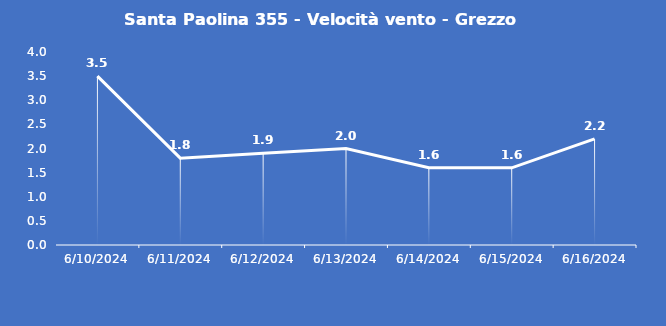
| Category | Santa Paolina 355 - Velocità vento - Grezzo (m/s) |
|---|---|
| 6/10/24 | 3.5 |
| 6/11/24 | 1.8 |
| 6/12/24 | 1.9 |
| 6/13/24 | 2 |
| 6/14/24 | 1.6 |
| 6/15/24 | 1.6 |
| 6/16/24 | 2.2 |